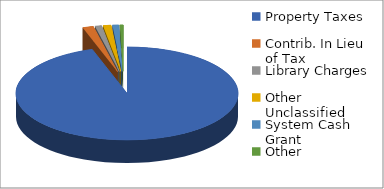
| Category | Series 0 |
|---|---|
| Property Taxes | 3949638 |
| Contrib. In Lieu of Tax | 65000 |
| Library Charges | 40000 |
| Other Unclassified | 48000 |
| System Cash Grant | 38000 |
| Other | 20400 |